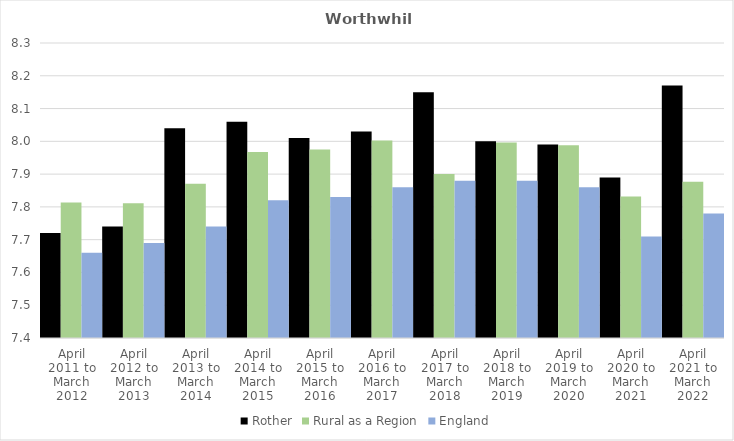
| Category | Rother | Rural as a Region | England |
|---|---|---|---|
| April 2011 to March 2012 | 7.72 | 7.813 | 7.66 |
| April 2012 to March 2013 | 7.74 | 7.811 | 7.69 |
| April 2013 to March 2014 | 8.04 | 7.871 | 7.74 |
| April 2014 to March 2015 | 8.06 | 7.967 | 7.82 |
| April 2015 to March 2016 | 8.01 | 7.975 | 7.83 |
| April 2016 to March 2017 | 8.03 | 8.002 | 7.86 |
| April 2017 to March 2018 | 8.15 | 7.9 | 7.88 |
| April 2018 to March 2019 | 8 | 7.996 | 7.88 |
| April 2019 to March 2020 | 7.99 | 7.988 | 7.86 |
| April 2020 to March 2021 | 7.89 | 7.831 | 7.71 |
| April 2021 to March 2022 | 8.17 | 7.877 | 7.78 |